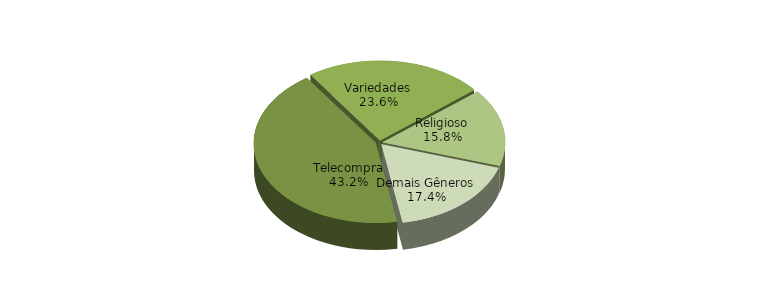
| Category | Series 0 |
|---|---|
| Telecompra | 0.432 |
| Variedades | 0.236 |
| Religioso | 0.158 |
| Demais Gêneros | 0.174 |